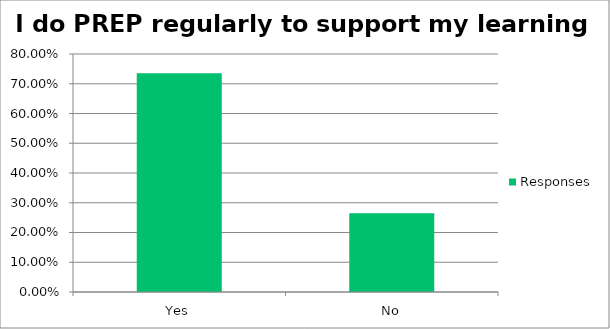
| Category | Responses |
|---|---|
| Yes | 0.735 |
| No | 0.265 |